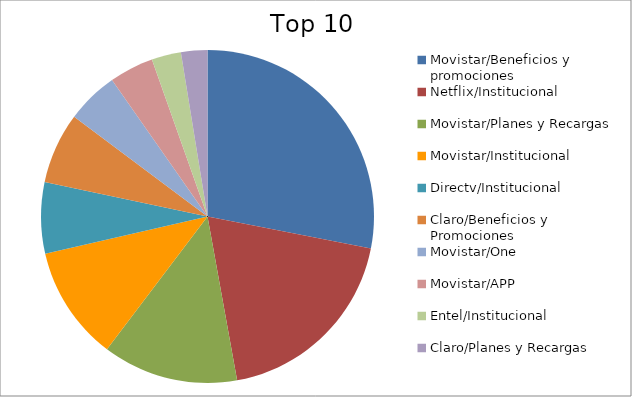
| Category | Series 0 |
|---|---|
| Movistar/Beneficios y promociones | 24.47 |
| Netflix/Institucional | 16.62 |
| Movistar/Planes y Recargas | 11.47 |
| Movistar/Institucional | 9.67 |
| Directv/Institucional | 6.03 |
| Claro/Beneficios y Promociones | 6 |
| Movistar/One | 4.41 |
| Movistar/APP | 3.75 |
| Entel/Institucional | 2.49 |
| Claro/Planes y Recargas | 2.23 |